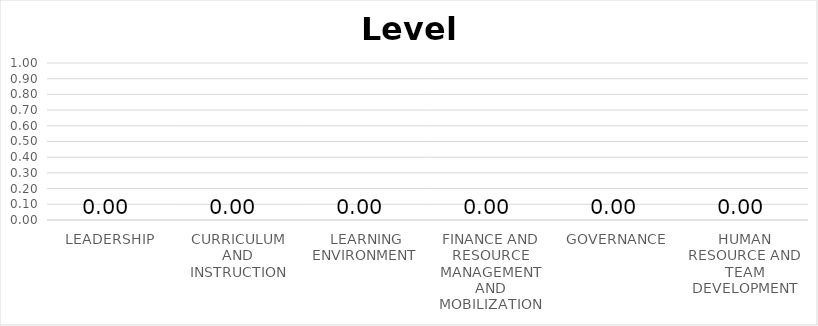
| Category | Series 11 |
|---|---|
| LEADERSHIP | 0 |
| CURRICULUM AND INSTRUCTION | 0 |
|  LEARNING ENVIRONMENT | 0 |
| FINANCE AND RESOURCE MANAGEMENT AND MOBILIZATION | 0 |
| GOVERNANCE | 0 |
| HUMAN RESOURCE AND TEAM DEVELOPMENT | 0 |